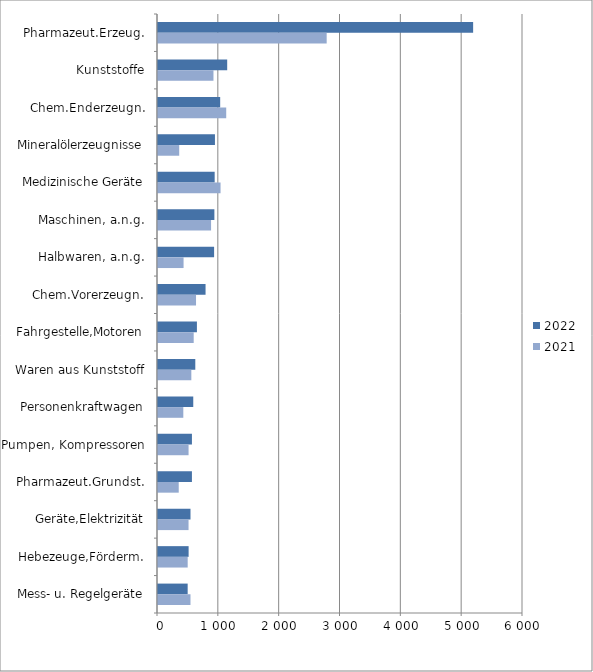
| Category | 2022 | 2021 |
|---|---|---|
| Pharmazeut.Erzeug. | 5180.267 | 2772.765 |
| Kunststoffe | 1137.408 | 911.778 |
| Chem.Enderzeugn. | 1022.174 | 1121.383 |
| Mineralölerzeugnisse | 936.148 | 348.666 |
| Medizinische Geräte | 931.476 | 1028.13 |
| Maschinen, a.n.g. | 926.825 | 872.365 |
| Halbwaren, a.n.g. | 922.281 | 420.291 |
| Chem.Vorerzeugn. | 781.74 | 625.154 |
| Fahrgestelle,Motoren | 639.716 | 586.709 |
| Waren aus Kunststoff | 613.149 | 547.947 |
| Personenkraftwagen | 579.611 | 416.178 |
| Pumpen, Kompressoren | 557.799 | 502.488 |
| Pharmazeut.Grundst. | 557.691 | 340.762 |
| Geräte,Elektrizität | 534.233 | 502.08 |
| Hebezeuge,Förderm. | 503.28 | 487.989 |
| Mess- u. Regelgeräte | 487.648 | 533.803 |